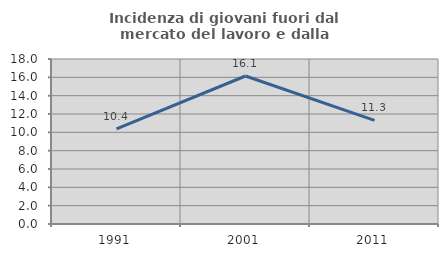
| Category | Incidenza di giovani fuori dal mercato del lavoro e dalla formazione  |
|---|---|
| 1991.0 | 10.387 |
| 2001.0 | 16.145 |
| 2011.0 | 11.302 |